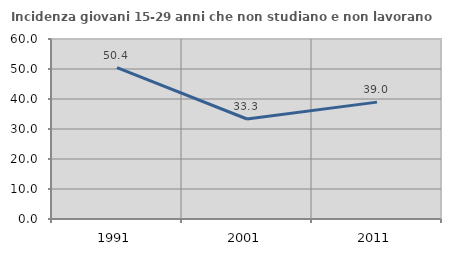
| Category | Incidenza giovani 15-29 anni che non studiano e non lavorano  |
|---|---|
| 1991.0 | 50.426 |
| 2001.0 | 33.333 |
| 2011.0 | 38.961 |